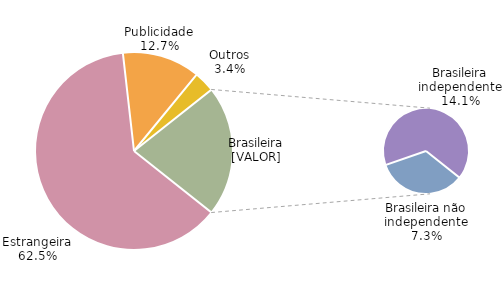
| Category | Series 0 |
|---|---|
| Estrangeira | 0.625 |
| Publicidade | 0.127 |
| Outros | 0.034 |
| Brasileira não independente | 0.073 |
| Brasileira independente | 0.141 |